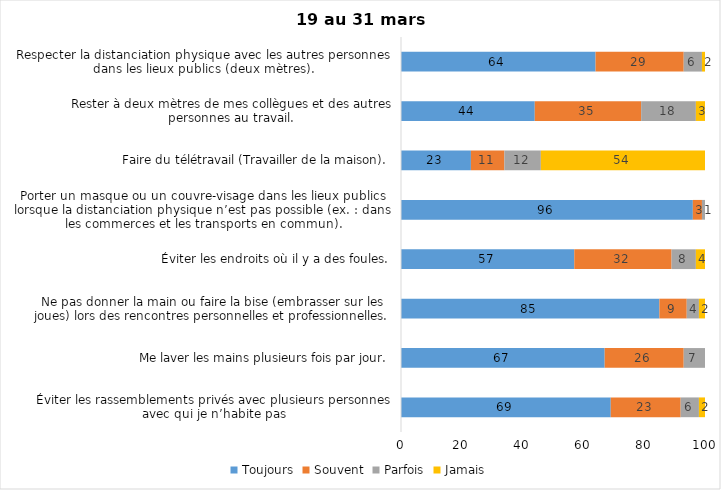
| Category | Toujours | Souvent | Parfois | Jamais |
|---|---|---|---|---|
| Éviter les rassemblements privés avec plusieurs personnes avec qui je n’habite pas | 69 | 23 | 6 | 2 |
| Me laver les mains plusieurs fois par jour. | 67 | 26 | 7 | 0 |
| Ne pas donner la main ou faire la bise (embrasser sur les joues) lors des rencontres personnelles et professionnelles. | 85 | 9 | 4 | 2 |
| Éviter les endroits où il y a des foules. | 57 | 32 | 8 | 4 |
| Porter un masque ou un couvre-visage dans les lieux publics lorsque la distanciation physique n’est pas possible (ex. : dans les commerces et les transports en commun). | 96 | 3 | 1 | 0 |
| Faire du télétravail (Travailler de la maison). | 23 | 11 | 12 | 54 |
| Rester à deux mètres de mes collègues et des autres personnes au travail. | 44 | 35 | 18 | 3 |
| Respecter la distanciation physique avec les autres personnes dans les lieux publics (deux mètres). | 64 | 29 | 6 | 2 |